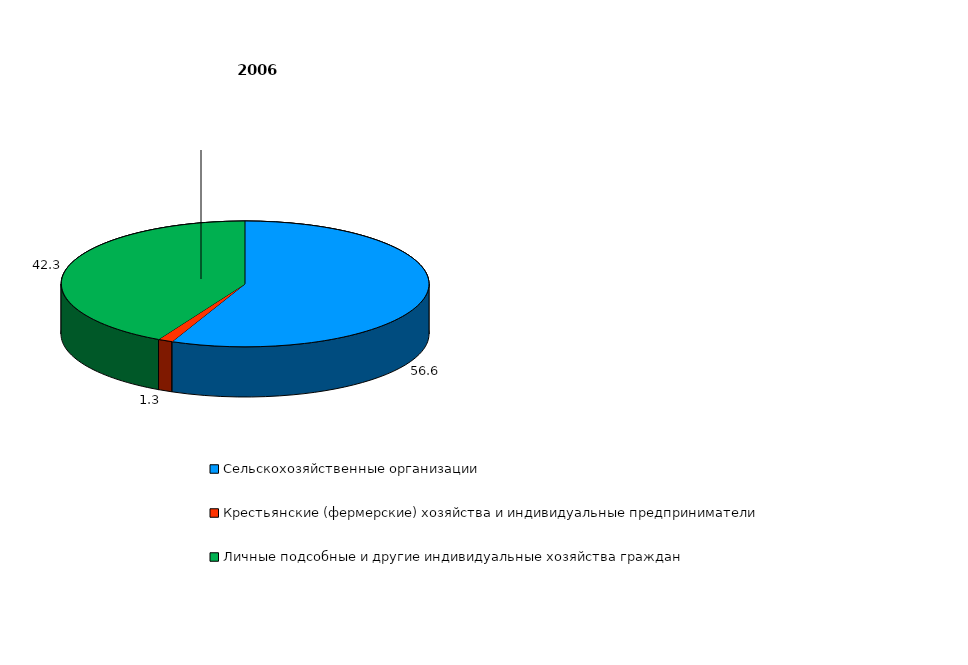
| Category | Series 0 |
|---|---|
| Сельскохозяйственные организации  | 56.6 |
| Крестьянские (фермерские) хозяйства и индивидуальные предприниматели  | 1.3 |
| Личные подсобные и другие индивидуальные хозяйства граждан  | 42.3 |